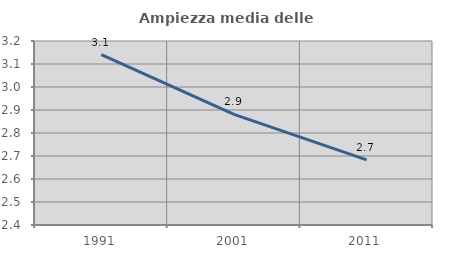
| Category | Ampiezza media delle famiglie |
|---|---|
| 1991.0 | 3.141 |
| 2001.0 | 2.881 |
| 2011.0 | 2.683 |